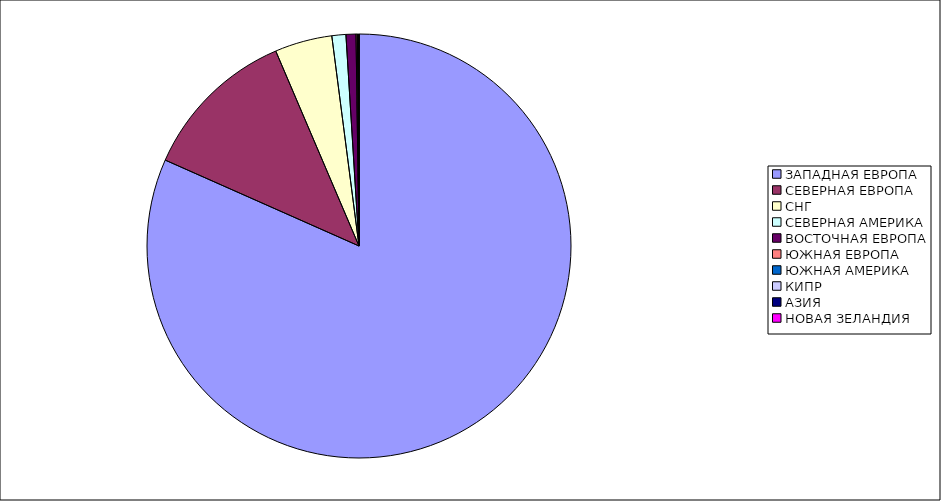
| Category | Оборот |
|---|---|
| ЗАПАДНАЯ ЕВРОПА | 0.816 |
| СЕВЕРНАЯ ЕВРОПА | 0.119 |
| СНГ | 0.044 |
| СЕВЕРНАЯ АМЕРИКА | 0.011 |
| ВОСТОЧНАЯ ЕВРОПА | 0.008 |
| ЮЖНАЯ ЕВРОПА | 0.001 |
| ЮЖНАЯ АМЕРИКА | 0.001 |
| КИПР | 0 |
| АЗИЯ | 0 |
| НОВАЯ ЗЕЛАНДИЯ | 0 |